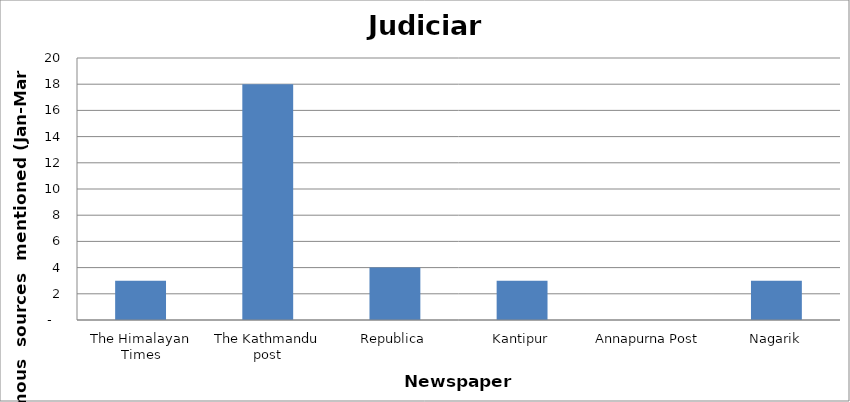
| Category | Judiciary |
|---|---|
| The Himalayan Times | 3 |
| The Kathmandu post | 18 |
| Republica | 4 |
| Kantipur | 3 |
| Annapurna Post | 0 |
| Nagarik | 3 |